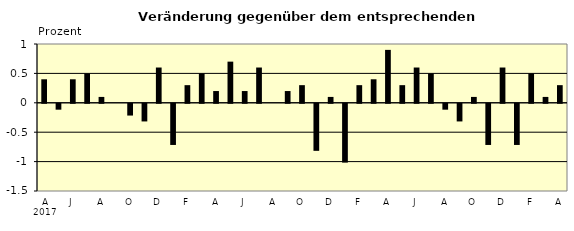
| Category | Series 0 |
|---|---|
| 0 | 0.4 |
| 1 | -0.1 |
| 2 | 0.4 |
| 3 | 0.5 |
| 4 | 0.1 |
| 5 | 0 |
| 6 | -0.2 |
| 7 | -0.3 |
| 8 | 0.6 |
| 9 | -0.7 |
| 10 | 0.3 |
| 11 | 0.5 |
| 12 | 0.2 |
| 13 | 0.7 |
| 14 | 0.2 |
| 15 | 0.6 |
| 16 | 0 |
| 17 | 0.2 |
| 18 | 0.3 |
| 19 | -0.8 |
| 20 | 0.1 |
| 21 | -1 |
| 22 | 0.3 |
| 23 | 0.4 |
| 24 | 0.9 |
| 25 | 0.3 |
| 26 | 0.6 |
| 27 | 0.5 |
| 28 | -0.1 |
| 29 | -0.3 |
| 30 | 0.1 |
| 31 | -0.7 |
| 32 | 0.6 |
| 33 | -0.7 |
| 34 | 0.5 |
| 35 | 0.1 |
| 36 | 0.3 |